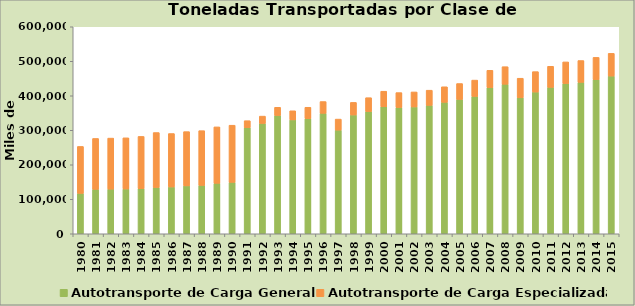
| Category | Autotransporte de Carga General | Autotransporte de Carga Especializada |
|---|---|---|
| 1980.0 | 117023 | 136146 |
| 1981.0 | 128754 | 147538 |
| 1982.0 | 129354 | 147999 |
| 1983.0 | 129714 | 148368 |
| 1984.0 | 130806 | 151377 |
| 1985.0 | 134112 | 159297 |
| 1986.0 | 135595 | 154964 |
| 1987.0 | 138810 | 157278 |
| 1988.0 | 140134 | 158736 |
| 1989.0 | 146292 | 163511 |
| 1990.0 | 149009 | 165666 |
| 1991.0 | 307444 | 20329 |
| 1992.0 | 319742 | 21318 |
| 1993.0 | 342871 | 23757 |
| 1994.0 | 330053 | 26434 |
| 1995.0 | 333800 | 32873 |
| 1996.0 | 349142 | 34125 |
| 1997.0 | 300444 | 32022 |
| 1998.0 | 344282 | 36519 |
| 1999.0 | 354241 | 40191 |
| 2000.0 | 368066 | 45127 |
| 2001.0 | 365912 | 43298 |
| 2002.0 | 367600 | 43500 |
| 2003.0 | 372150 | 44050 |
| 2004.0 | 381000 | 45100 |
| 2005.0 | 389400 | 46100 |
| 2006.0 | 398158 | 47291 |
| 2007.0 | 423458.767 | 50401.095 |
| 2008.0 | 433400 | 50900 |
| 2009.0 | 394079 | 56821 |
| 2010.0 | 410772 | 59228 |
| 2011.0 | 424321 | 61181 |
| 2012.0 | 435373 | 62774 |
| 2013.0 | 438871 | 63279 |
| 2014.0 | 446903 | 64437 |
| 2015.0 | 457085 | 65905 |